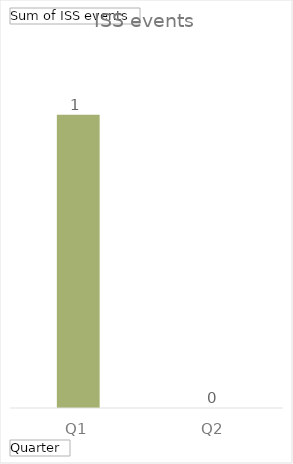
| Category | Total |
|---|---|
| Q1 | 1 |
| Q2 | 0 |